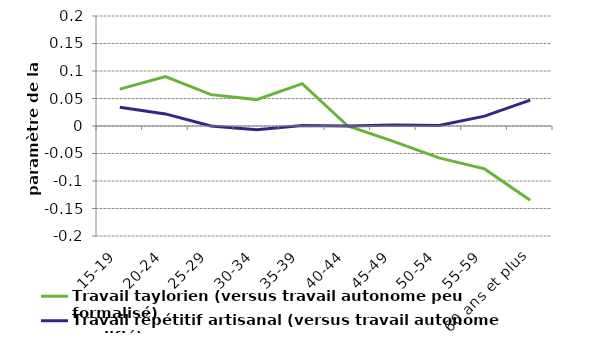
| Category | Travail taylorien (versus travail autonome peu formalisé) | Travail répétitif artisanal (versus travail autonome qualifié) |
|---|---|---|
| 15-19 | 0.067 | 0.034 |
| 20-24 | 0.09 | 0.022 |
| 25-29 | 0.057 | 0 |
| 30-34 | 0.048 | -0.007 |
| 35-39 | 0.077 | 0.001 |
| 40-44 | 0 | 0 |
| 45-49 | -0.028 | 0.002 |
| 50-54 | -0.058 | 0.001 |
| 55-59 | -0.078 | 0.018 |
| 60 ans et plus | -0.135 | 0.047 |